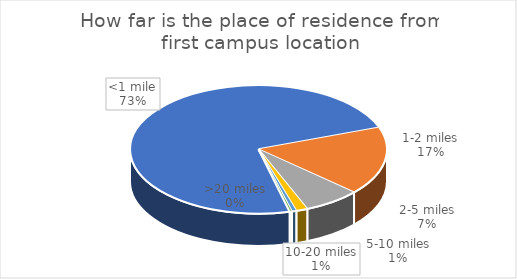
| Category | Series 0 |
|---|---|
| <1 mile | 256 |
| 1-2 miles | 60 |
| 2-5 miles | 25 |
| 5-10 miles | 5 |
| 10-20 miles | 2 |
| >20 miles | 1 |